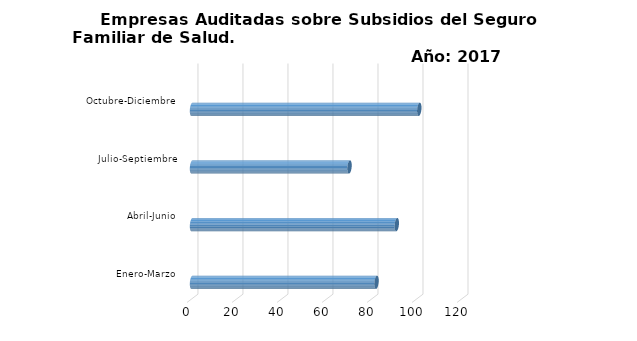
| Category | Empresas Auditadas | Series 1 | Series 2 |
|---|---|---|---|
| Enero-Marzo | 82 |  |  |
| Abril-Junio | 91 |  |  |
| Julio-Septiembre | 70 |  |  |
| Octubre-Diciembre | 101 |  |  |